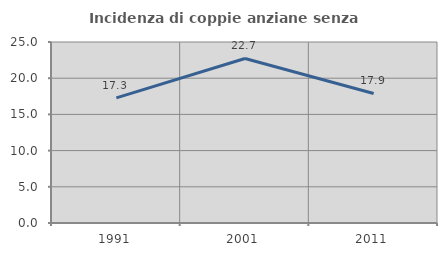
| Category | Incidenza di coppie anziane senza figli  |
|---|---|
| 1991.0 | 17.284 |
| 2001.0 | 22.727 |
| 2011.0 | 17.895 |